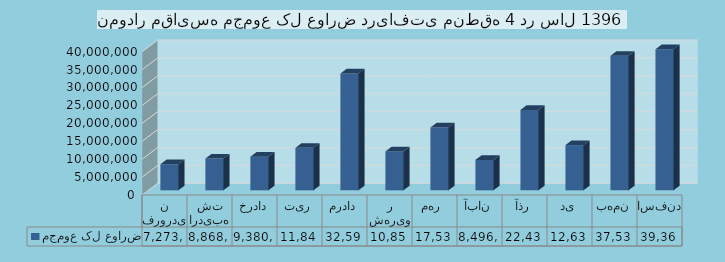
| Category | مجموع کل عوارض |
|---|---|
| فروردین | 7273485 |
| اردیبهشت | 8868398 |
| خرداد | 9380540 |
| تیر | 11849136 |
| مرداد | 32595056 |
| شهریور | 10852938 |
| مهر  | 17531892 |
| آبان | 8496097 |
| آذر | 22436363 |
| دی | 12631293 |
| بهمن | 37536007 |
| اسفند | 39362725 |